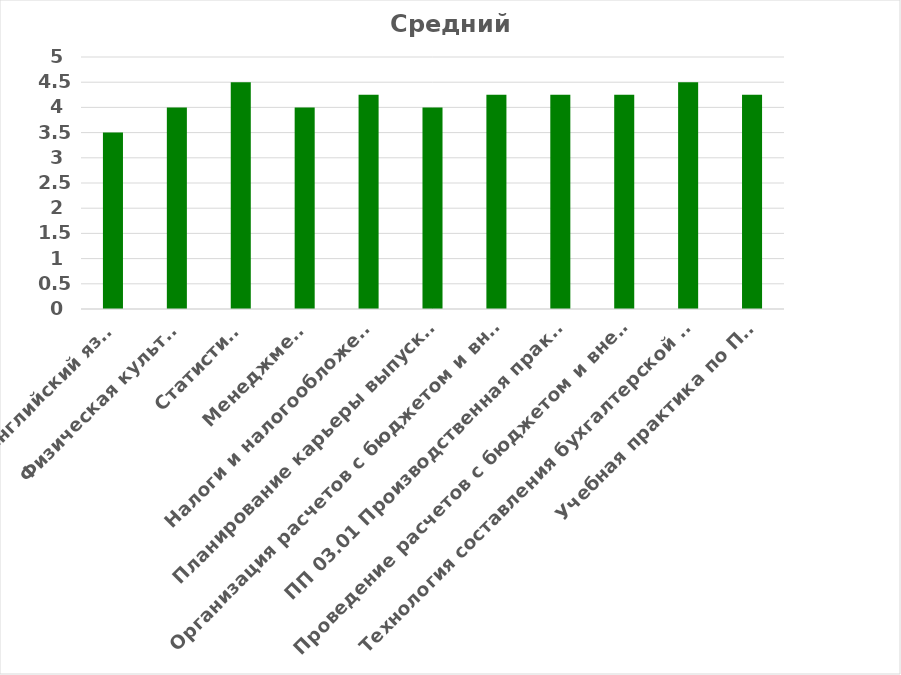
| Category | Средний балл |
|---|---|
| Английский язык | 3.5 |
| Физическая культура | 4 |
| Статистика | 4.5 |
| Менеджмент | 4 |
| Налоги и налогообложение | 4.25 |
| Планирование карьеры выпускника | 4 |
| Организация расчетов с бюджетом и внебюджетными фондами | 4.25 |
| ПП 03.01 Производственная практика | 4.25 |
| Проведение расчетов с бюджетом и внебюджетными фондами | 4.25 |
| Технология составления бухгалтерской отчетности | 4.5 |
| Учебная практика по ПМ.05 | 4.25 |